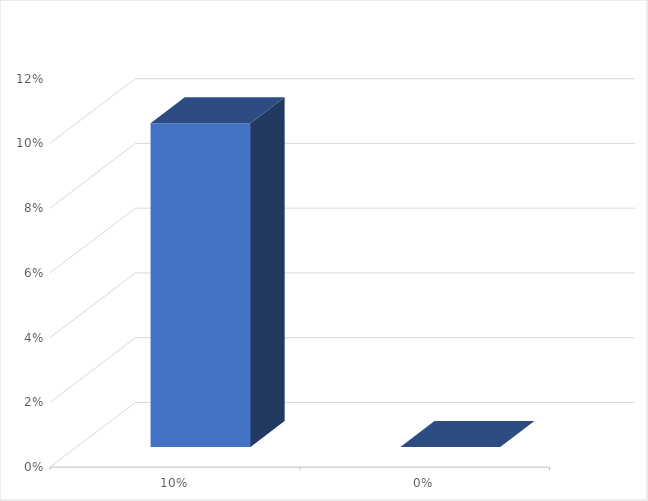
| Category | Series 0 |
|---|---|
| 0.1 | 0.1 |
| 0.0 | 0 |